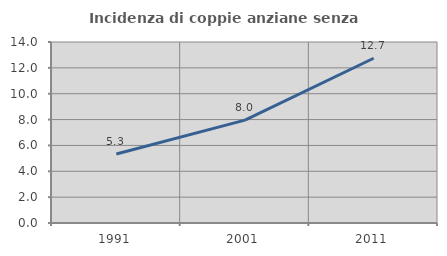
| Category | Incidenza di coppie anziane senza figli  |
|---|---|
| 1991.0 | 5.342 |
| 2001.0 | 7.958 |
| 2011.0 | 12.744 |